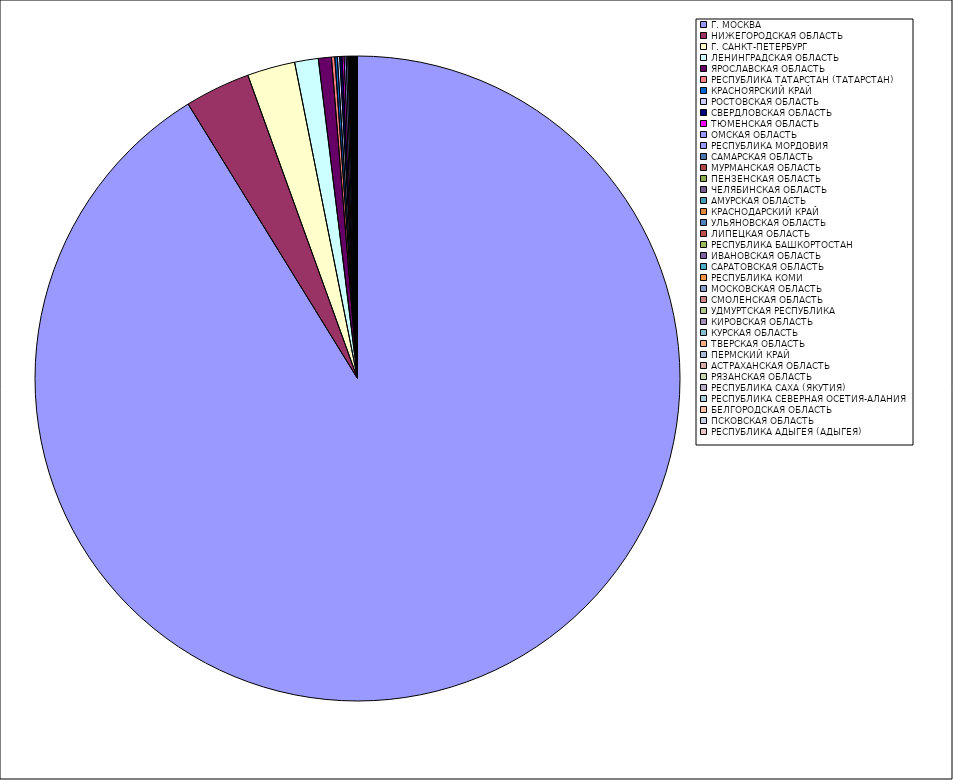
| Category | Оборот |
|---|---|
| Г. МОСКВА | 91.163 |
| НИЖЕГОРОДСКАЯ ОБЛАСТЬ | 3.279 |
| Г. САНКТ-ПЕТЕРБУРГ | 2.396 |
| ЛЕНИНГРАДСКАЯ ОБЛАСТЬ | 1.181 |
| ЯРОСЛАВСКАЯ ОБЛАСТЬ | 0.653 |
| РЕСПУБЛИКА ТАТАРСТАН (ТАТАРСТАН) | 0.165 |
| КРАСНОЯРСКИЙ КРАЙ | 0.127 |
| РОСТОВСКАЯ ОБЛАСТЬ | 0.12 |
| СВЕРДЛОВСКАЯ ОБЛАСТЬ | 0.114 |
| ТЮМЕНСКАЯ ОБЛАСТЬ | 0.1 |
| ОМСКАЯ ОБЛАСТЬ | 0.1 |
| РЕСПУБЛИКА МОРДОВИЯ | 0.082 |
| САМАРСКАЯ ОБЛАСТЬ | 0.054 |
| МУРМАНСКАЯ ОБЛАСТЬ | 0.041 |
| ПЕНЗЕНСКАЯ ОБЛАСТЬ | 0.04 |
| ЧЕЛЯБИНСКАЯ ОБЛАСТЬ | 0.032 |
| АМУРСКАЯ ОБЛАСТЬ | 0.031 |
| КРАСНОДАРСКИЙ КРАЙ | 0.031 |
| УЛЬЯНОВСКАЯ ОБЛАСТЬ | 0.025 |
| ЛИПЕЦКАЯ ОБЛАСТЬ | 0.021 |
| РЕСПУБЛИКА БАШКОРТОСТАН | 0.02 |
| ИВАНОВСКАЯ ОБЛАСТЬ | 0.019 |
| САРАТОВСКАЯ ОБЛАСТЬ | 0.018 |
| РЕСПУБЛИКА КОМИ | 0.015 |
| МОСКОВСКАЯ ОБЛАСТЬ | 0.015 |
| СМОЛЕНСКАЯ ОБЛАСТЬ | 0.014 |
| УДМУРТСКАЯ РЕСПУБЛИКА | 0.014 |
| КИРОВСКАЯ ОБЛАСТЬ | 0.013 |
| КУРСКАЯ ОБЛАСТЬ | 0.012 |
| ТВЕРСКАЯ ОБЛАСТЬ | 0.012 |
| ПЕРМСКИЙ КРАЙ | 0.009 |
| АСТРАХАНСКАЯ ОБЛАСТЬ | 0.009 |
| РЯЗАНСКАЯ ОБЛАСТЬ | 0.009 |
| РЕСПУБЛИКА САХА (ЯКУТИЯ) | 0.007 |
| РЕСПУБЛИКА СЕВЕРНАЯ ОСЕТИЯ-АЛАНИЯ | 0.006 |
| БЕЛГОРОДСКАЯ ОБЛАСТЬ | 0.006 |
| ПСКОВСКАЯ ОБЛАСТЬ | 0.005 |
| РЕСПУБЛИКА АДЫГЕЯ (АДЫГЕЯ) | 0.005 |